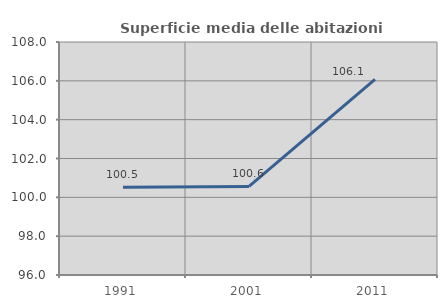
| Category | Superficie media delle abitazioni occupate |
|---|---|
| 1991.0 | 100.515 |
| 2001.0 | 100.564 |
| 2011.0 | 106.079 |